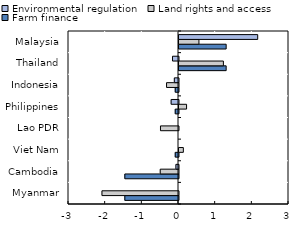
| Category | Farm finance | Land rights and access | Environmental regulation |
|---|---|---|---|
| Myanmar | -1.464 | -2.087 | 0 |
| Cambodia | -1.464 | -0.498 | -0.071 |
| Viet Nam | -0.089 | 0.119 | 0 |
| Lao PDR | 0 | -0.492 | 0 |
| Philippines | -0.089 | 0.206 | -0.201 |
| Indonesia | -0.089 | -0.326 | -0.114 |
| Thailand | 1.286 | 1.211 | -0.164 |
| Malaysia | 1.286 | 0.544 | 2.147 |